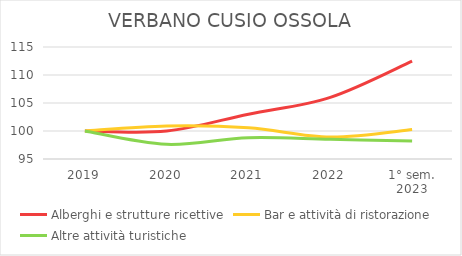
| Category | Alberghi e strutture ricettive | Bar e attività di ristorazione | Altre attività turistiche |
|---|---|---|---|
| 2019 | 100 | 100 | 100 |
| 2020 | 100 | 100.895 | 97.619 |
| 2021 | 103.002 | 100.575 | 98.81 |
| 2022 | 106.005 | 98.914 | 98.512 |
| 1° sem.
2023 | 112.471 | 100.256 | 98.214 |